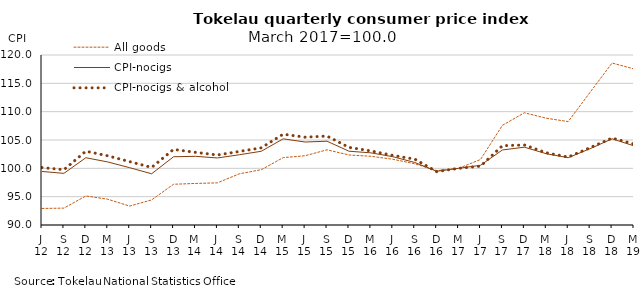
| Category | All goods | CPI-nocigs | CPI-nocigs & alcohol |
|---|---|---|---|
| J
12 | 92.92 | 99.448 | 100.134 |
| S
12 | 92.978 | 99.114 | 99.752 |
| D
12 | 95.127 | 101.87 | 103.027 |
| M
13 | 94.545 | 101.124 | 102.207 |
| J
13 | 93.34 | 100.111 | 101.174 |
| S
13 | 94.43 | 99.037 | 100.159 |
| D
13 | 97.189 | 102.043 | 103.344 |
| M
14 | 97.334 | 102.121 | 102.819 |
| J
14 | 97.439 | 101.829 | 102.359 |
| S
14 | 99.033 | 102.398 | 102.973 |
| D
14 | 99.759 | 103.009 | 103.619 |
| M
15 | 101.888 | 105.207 | 106.024 |
| J
15 | 102.222 | 104.642 | 105.5 |
| S
15 | 103.271 | 104.785 | 105.69 |
| D
15 | 102.355 | 103.021 | 103.696 |
| M
16 | 102.13 | 102.732 | 103.073 |
| J
16 | 101.602 | 102.054 | 102.283 |
| S
16 | 100.809 | 101.037 | 101.619 |
| D
16 | 99.593 | 99.478 | 99.419 |
| M
17 | 100 | 100 | 100 |
| J
17 | 101.558 | 100.54 | 100.387 |
| S
17 | 107.591 | 103.243 | 103.994 |
| D
17 | 109.807 | 103.733 | 104.123 |
| M
18 | 108.838 | 102.577 | 102.745 |
| J
18 | 108.251 | 101.877 | 101.992 |
| S
18 | 113.433 | 103.472 | 103.647 |
| D
18 | 118.583 | 105.207 | 105.341 |
| M
19 | 117.544 | 103.967 | 104.289 |